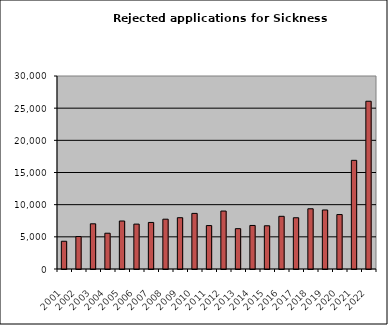
| Category | Series 0 |
|---|---|
| 2001.0 | 4312 |
| 2002.0 | 5045 |
| 2003.0 | 7026 |
| 2004.0 | 5561 |
| 2005.0 | 7461 |
| 2006.0 | 6976 |
| 2007.0 | 7236 |
| 2008.0 | 7742 |
| 2009.0 | 7973 |
| 2010.0 | 8643 |
| 2011.0 | 6750 |
| 2012.0 | 9008 |
| 2013.0 | 6269 |
| 2014.0 | 6767 |
| 2015.0 | 6720 |
| 2016.0 | 8189 |
| 2017.0 | 7966 |
| 2018.0 | 9362 |
| 2019.0 | 9175 |
| 2020.0 | 8462 |
| 2021.0 | 16891 |
| 2022.0 | 26077 |